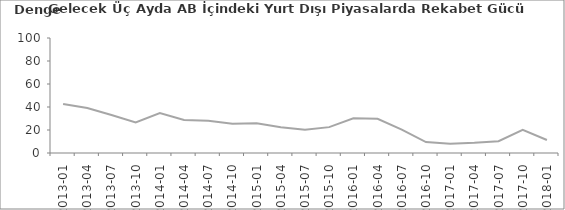
| Category | Gelecek Üç Aydaki AB İçindeki Piyasalarda Rekabet Gücü Beklentisi |
|---|---|
| 2013-01 | 42.7 |
| 2013-04 | 39.2 |
| 2013-07 | 33.1 |
| 2013-10 | 26.6 |
| 2014-01 | 34.7 |
| 2014-04 | 28.7 |
| 2014-07 | 28.1 |
| 2014-10 | 25.4 |
| 2015-01 | 25.8 |
| 2015-04 | 22.3 |
| 2015-07 | 20.3 |
| 2015-10 | 22.5 |
| 2016-01 | 30.2 |
| 2016-04 | 29.7 |
| 2016-07 | 20.4 |
| 2016-10 | 9.5 |
| 2017-01 | 8 |
| 2017-04 | 8.9 |
| 2017-07 | 10.3 |
| 2017-10 | 20.1 |
| 2018-01 | 11.3 |